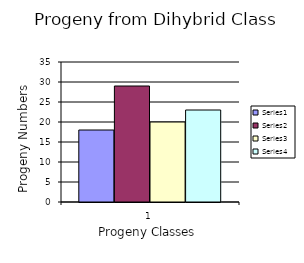
| Category | Series 0 | Series 1 | Series 2 | Series 3 |
|---|---|---|---|---|
| 0 | 18 | 29 | 20 | 23 |